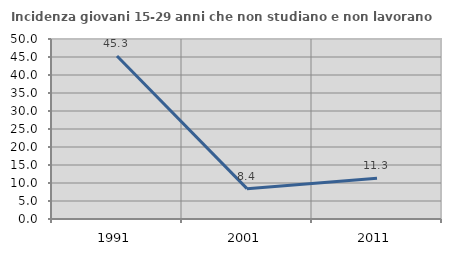
| Category | Incidenza giovani 15-29 anni che non studiano e non lavorano  |
|---|---|
| 1991.0 | 45.272 |
| 2001.0 | 8.427 |
| 2011.0 | 11.29 |